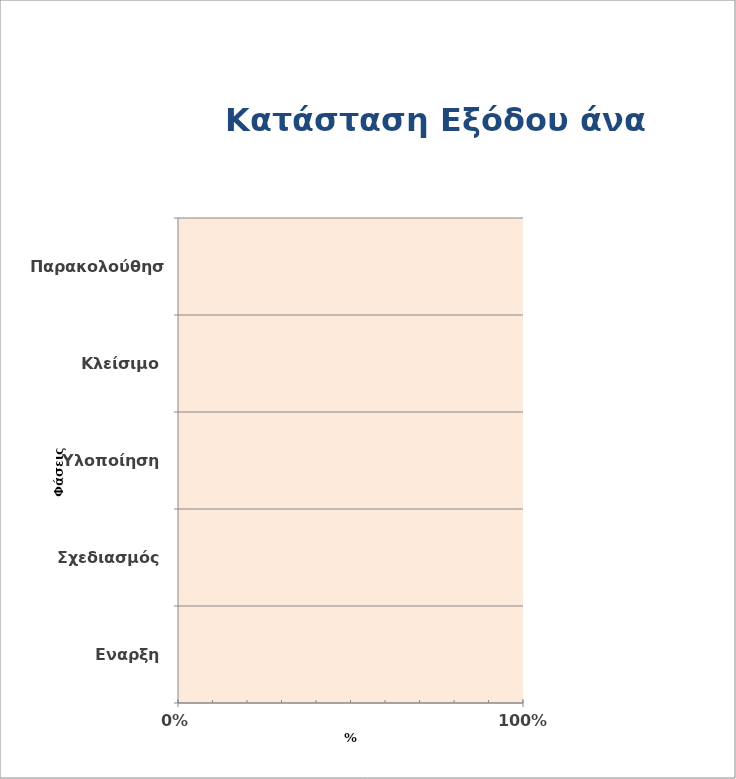
| Category | Series 0 |
|---|---|
| Εναρξη | 0 |
| Σχεδιασμός | 0 |
| Υλοποίηση | 0 |
| Κλείσιμο | 0 |
| Παρακολούθηση | 0 |